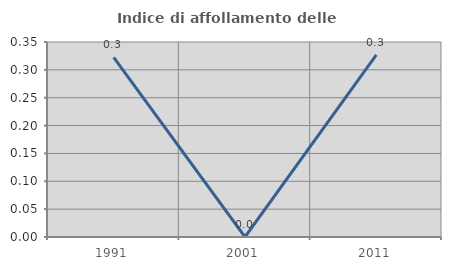
| Category | Indice di affollamento delle abitazioni  |
|---|---|
| 1991.0 | 0.323 |
| 2001.0 | 0 |
| 2011.0 | 0.327 |